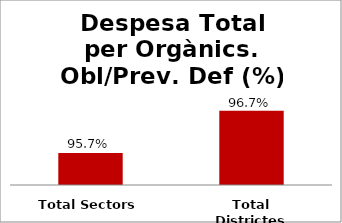
| Category | Series 0 |
|---|---|
| Total Sectors | 0.957 |
| Total Districtes | 0.967 |